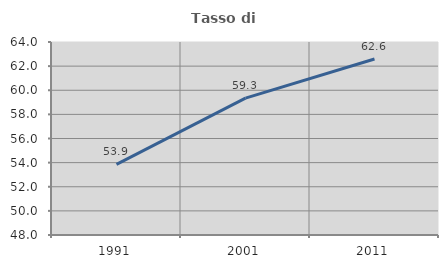
| Category | Tasso di occupazione   |
|---|---|
| 1991.0 | 53.854 |
| 2001.0 | 59.345 |
| 2011.0 | 62.592 |